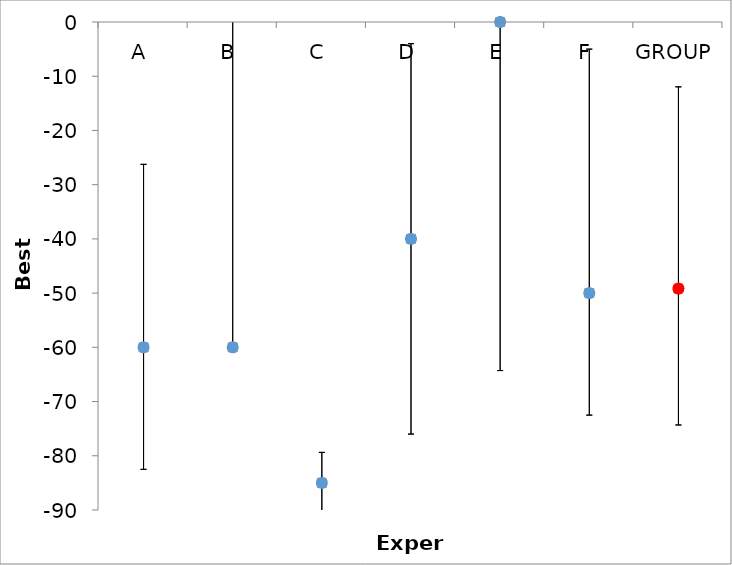
| Category | Series 1 | Series 0 |
|---|---|---|
| A | -60 | -60 |
| B | -60 | -60 |
| C | -85 | -85 |
| D | -40 | -40 |
| E | 0 | 0 |
| F | -50 | -50 |
| GROUP | -49.167 | -49.167 |